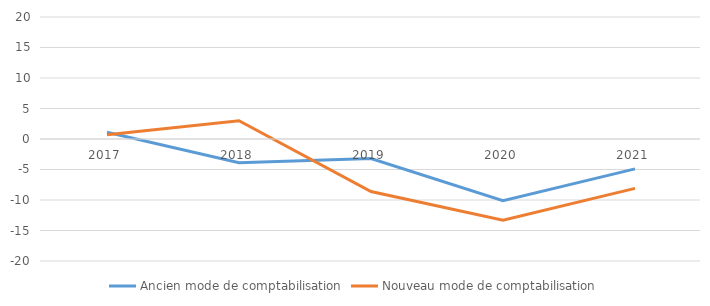
| Category | Ancien mode de comptabilisation | Nouveau mode de comptabilisation |
|---|---|---|
| 2017.0 | 1.1 | 0.7 |
| 2018.0 | -3.9 | 3 |
| 2019.0 | -3.2 | -8.6 |
| 2020.0 | -10.1 | -13.3 |
| 2021.0 | -4.9 | -8.1 |